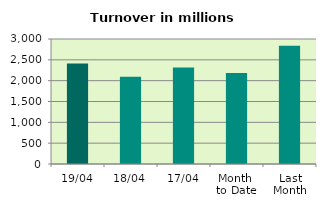
| Category | Series 0 |
|---|---|
| 19/04 | 2411.79 |
| 18/04 | 2092.288 |
| 17/04 | 2316.786 |
| Month 
to Date | 2181.808 |
| Last
Month | 2840.905 |